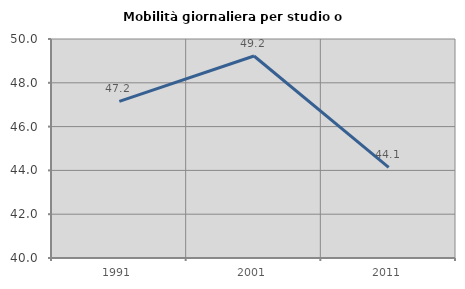
| Category | Mobilità giornaliera per studio o lavoro |
|---|---|
| 1991.0 | 47.153 |
| 2001.0 | 49.223 |
| 2011.0 | 44.134 |